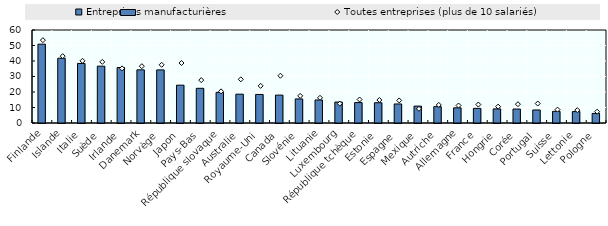
| Category | Entreprises manufacturières |
|---|---|
| Finlande | 50.862 |
| Islande | 41.79 |
| Italie | 38.424 |
| Suède | 36.672 |
| Irlande | 35.802 |
| Danemark | 34.297 |
| Norvège | 34.257 |
| Japon | 24.4 |
| Pays-Bas | 22.384 |
| République slovaque | 19.76 |
| Australie | 18.59 |
| Royaume-Uni | 18.409 |
| Canada | 18 |
| Slovénie | 15.532 |
| Lituanie | 14.855 |
| Luxembourg | 13.513 |
| République tchèque | 13.169 |
| Estonie | 13.065 |
| Espagne | 12.284 |
| Mexique | 10.907 |
| Autriche | 10.528 |
| Allemagne | 9.784 |
| France | 9.452 |
| Hongrie | 9.102 |
| Corée | 9.007 |
| Portugal | 8.405 |
| Suisse | 7.517 |
| Lettonie | 7.359 |
| Pologne | 6.175 |